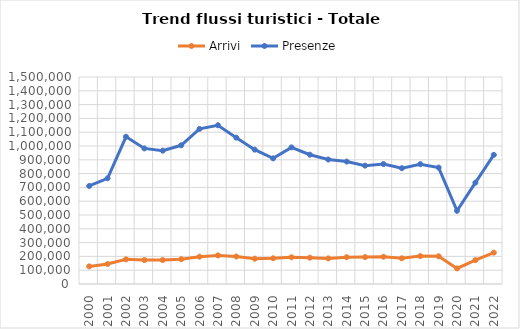
| Category | Arrivi | Presenze |
|---|---|---|
| 2000.0 | 127566 | 710255 |
| 2001.0 | 144997 | 765988 |
| 2002.0 | 178695 | 1066898 |
| 2003.0 | 173302 | 982465 |
| 2004.0 | 173691 | 966225 |
| 2005.0 | 179652 | 1005195 |
| 2006.0 | 198010 | 1124185 |
| 2007.0 | 207278 | 1150415 |
| 2008.0 | 199152 | 1060505 |
| 2009.0 | 183315 | 973628 |
| 2010.0 | 186236 | 910447 |
| 2011.0 | 193525 | 990128 |
| 2012.0 | 190749 | 936959 |
| 2013.0 | 185469 | 901969 |
| 2014.0 | 194119 | 887150 |
| 2015.0 | 194881 | 857750 |
| 2016.0 | 197530 | 869128 |
| 2017.0 | 186335 | 839059 |
| 2018.0 | 202224 | 868384 |
| 2019.0 | 200888 | 843773 |
| 2020.0 | 112870 | 530588 |
| 2021.0 | 172553 | 734266 |
| 2022.0 | 227391 | 935660 |